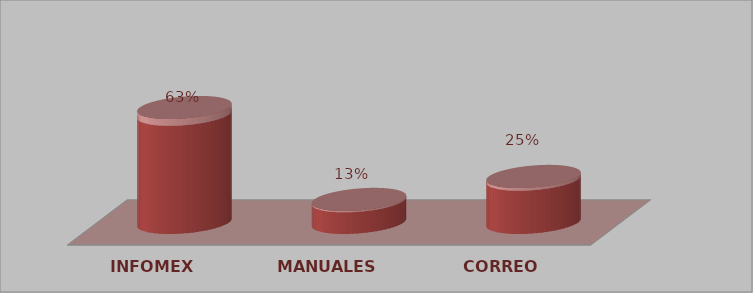
| Category | Series 0 | Series 1 |
|---|---|---|
| INFOMEX | 10 | 0.625 |
| MANUALES | 2 | 0.125 |
| CORREO | 4 | 0.25 |